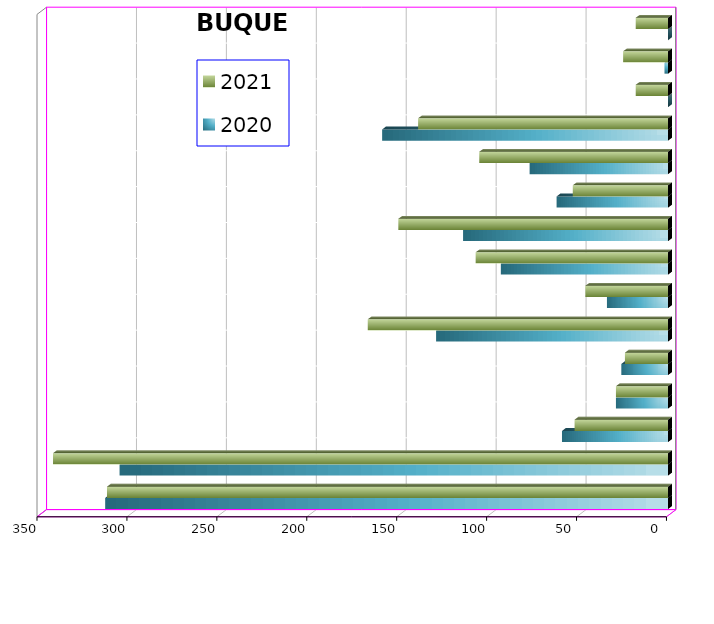
| Category | 2020 | 2021 |
|---|---|---|
| ICAVE | 313 | 312 |
| CICE | 305 | 342 |
| T. C. E. | 59 | 52 |
| CARGILL | 29 | 29 |
| TMV | 26 | 24 |
| SSA | 129 | 167 |
| SEPSA | 34 | 46 |
| VOPAK | 93 | 107 |
| CPV | 114 | 150 |
| EXCELLENCE | 62 | 53 |
| SIPPB | 77 | 105 |
| PEMEX | 159 | 139 |
| PETRA | 0 | 18 |
| OPEVER | 2 | 25 |
| ESJ ERNOVABLE III | 0 | 18 |